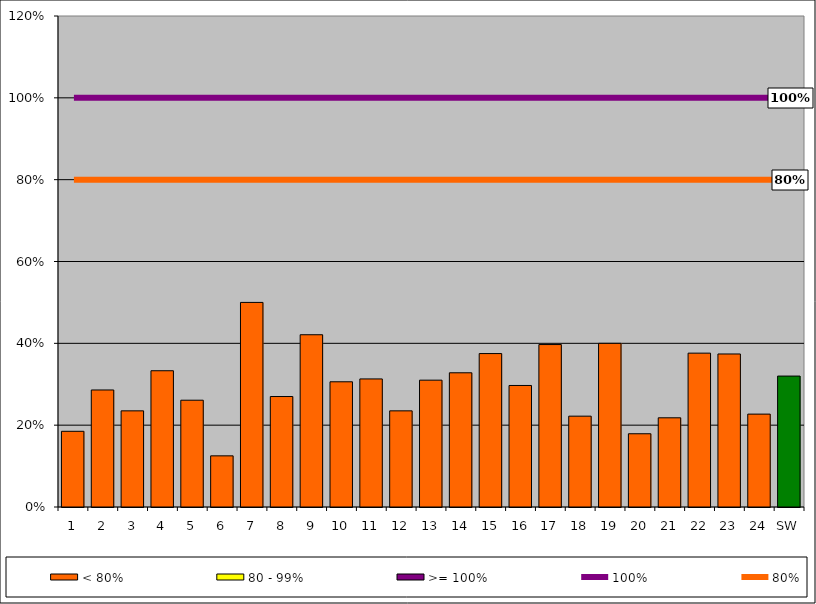
| Category | < 80% | 80 - 99% | >= 100% |
|---|---|---|---|
| 1 | 0.185 | 0 | 0 |
| 2 | 0.286 | 0 | 0 |
| 3 | 0.235 | 0 | 0 |
| 4 | 0.333 | 0 | 0 |
| 5 | 0.261 | 0 | 0 |
| 6 | 0.125 | 0 | 0 |
| 7 | 0.5 | 0 | 0 |
| 8 | 0.27 | 0 | 0 |
| 9 | 0.421 | 0 | 0 |
| 10 | 0.306 | 0 | 0 |
| 11 | 0.313 | 0 | 0 |
| 12 | 0.235 | 0 | 0 |
| 13 | 0.31 | 0 | 0 |
| 14 | 0.328 | 0 | 0 |
| 15 | 0.375 | 0 | 0 |
| 16 | 0.297 | 0 | 0 |
| 17 | 0.397 | 0 | 0 |
| 18 | 0.222 | 0 | 0 |
| 19 | 0.4 | 0 | 0 |
| 20 | 0.179 | 0 | 0 |
| 21 | 0.218 | 0 | 0 |
| 22 | 0.376 | 0 | 0 |
| 23 | 0.374 | 0 | 0 |
| 24 | 0.227 | 0 | 0 |
| SW | 0.32 | 0 | 0 |